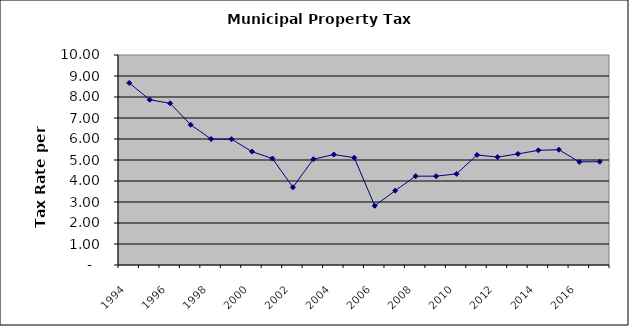
| Category | Rate |
|---|---|
| 1994.0 | 8.67 |
| 1995.0 | 7.87 |
| 1996.0 | 7.7 |
| 1997.0 | 6.68 |
| 1998.0 | 6 |
| 1999.0 | 5.99 |
| 2000.0 | 5.4 |
| 2001.0 | 5.07 |
| 2002.0 | 3.7 |
| 2003.0 | 5.04 |
| 2004.0 | 5.26 |
| 2005.0 | 5.11 |
| 2006.0 | 2.82 |
| 2007.0 | 3.54 |
| 2008.0 | 4.23 |
| 2009.0 | 4.23 |
| 2010.0 | 4.34 |
| 2011.0 | 5.24 |
| 2012.0 | 5.14 |
| 2013.0 | 5.29 |
| 2014.0 | 5.46 |
| 2015.0 | 5.49 |
| 2016.0 | 4.91 |
| 2017.0 | 4.92 |